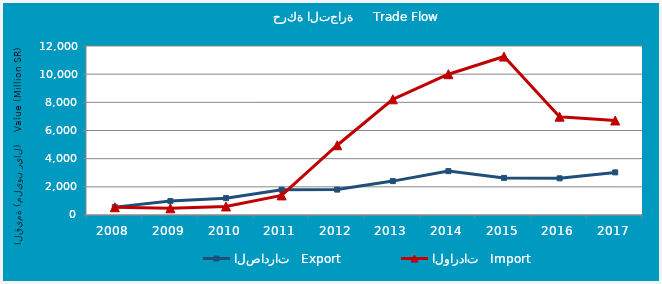
| Category | الصادرات   Export | الواردات   Import |
|---|---|---|
| 2008.0 | 559137601 | 549543159 |
| 2009.0 | 987022297 | 477015029 |
| 2010.0 | 1197208048 | 607322872 |
| 2011.0 | 1796453789 | 1391921185 |
| 2012.0 | 1803195987 | 4952975328 |
| 2013.0 | 2406576421 | 8216343098 |
| 2014.0 | 3115123290 | 9997624106 |
| 2015.0 | 2635999903 | 11249555460 |
| 2016.0 | 2604767068 | 6981829012 |
| 2017.0 | 3025950574 | 6710351659 |